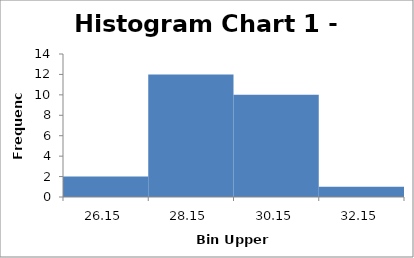
| Category | Series 0 |
|---|---|
| 26.15 | 2 |
| 28.15 | 12 |
| 30.15 | 10 |
| 32.15 | 1 |